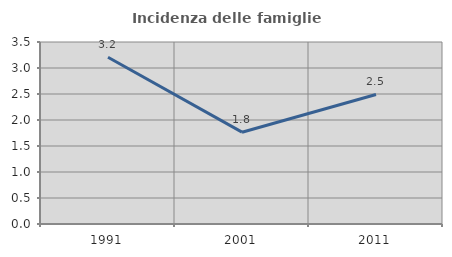
| Category | Incidenza delle famiglie numerose |
|---|---|
| 1991.0 | 3.206 |
| 2001.0 | 1.766 |
| 2011.0 | 2.491 |